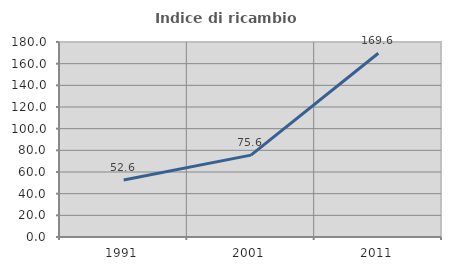
| Category | Indice di ricambio occupazionale  |
|---|---|
| 1991.0 | 52.621 |
| 2001.0 | 75.576 |
| 2011.0 | 169.577 |